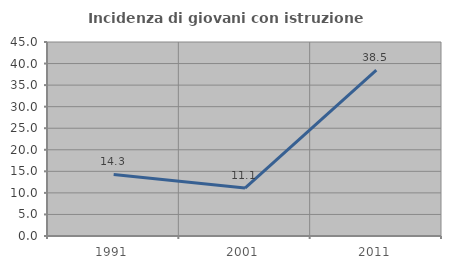
| Category | Incidenza di giovani con istruzione universitaria |
|---|---|
| 1991.0 | 14.286 |
| 2001.0 | 11.111 |
| 2011.0 | 38.462 |